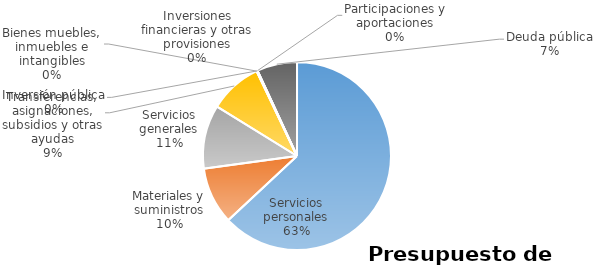
| Category | Series 0 | Series 1 | Series 2 | Series 3 | Series 4 | Series 5 |
|---|---|---|---|---|---|---|
| Servicios personales | 91556938 |  |  |  |  |  |
| Materiales y suministros | 14232000 |  |  |  |  |  |
| Servicios generales | 15935352 |  |  |  |  |  |
| Transferencias, asignaciones, subsidios y otras ayudas | 13240004 |  |  |  |  |  |
| Bienes muebles, inmuebles e intangibles | 0 |  |  |  |  |  |
| Inversión pública | 231337 |  |  |  |  |  |
| Inversiones financieras y otras provisiones | 0 |  |  |  |  |  |
| Participaciones y aportaciones | 0 |  |  |  |  |  |
| Deuda pública | 10032560 |  |  |  |  |  |